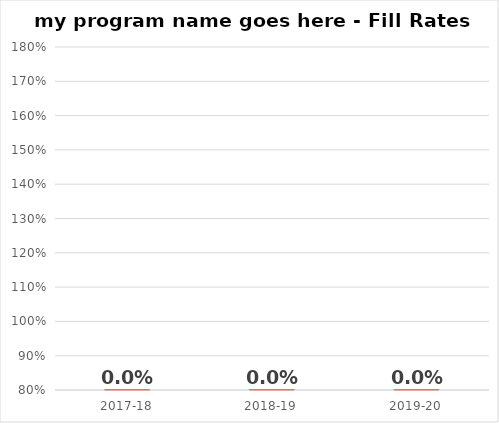
| Category | Fill |
|---|---|
| 2017-18 | 0 |
| 2018-19 | 0 |
| 2019-20 | 0 |